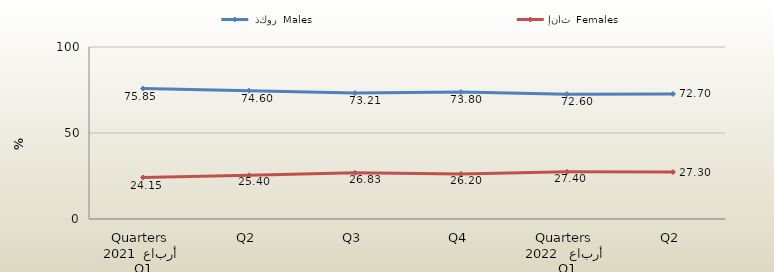
| Category |  ذكور  Males | إناث  Females |
|---|---|---|
| 0 | 75.852 | 24.148 |
| 1 | 74.599 | 25.401 |
| 2 | 73.206 | 26.833 |
| 3 | 73.8 | 26.2 |
| 4 | 72.6 | 27.4 |
| 5 | 72.7 | 27.3 |